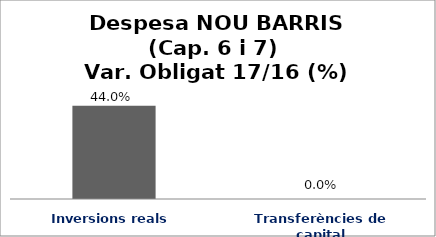
| Category | Series 0 |
|---|---|
| Inversions reals | 0.44 |
| Transferències de capital | 0 |